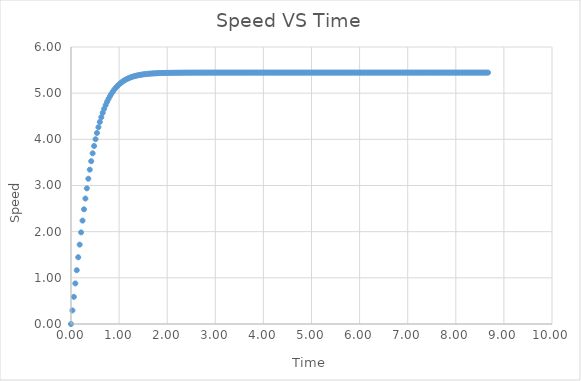
| Category | Series 0 |
|---|---|
| 0.0 | 0 |
| 0.03 | 0.294 |
| 0.06 | 0.588 |
| 0.09 | 0.879 |
| 0.12 | 1.165 |
| 0.15 | 1.446 |
| 0.18 | 1.72 |
| 0.21 | 1.985 |
| 0.24 | 2.24 |
| 0.27 | 2.484 |
| 0.30000000000000004 | 2.717 |
| 0.33000000000000007 | 2.938 |
| 0.3600000000000001 | 3.147 |
| 0.3900000000000001 | 3.343 |
| 0.42000000000000015 | 3.526 |
| 0.4500000000000002 | 3.697 |
| 0.4800000000000002 | 3.856 |
| 0.5100000000000002 | 4.003 |
| 0.5400000000000003 | 4.138 |
| 0.5700000000000003 | 4.262 |
| 0.6000000000000003 | 4.376 |
| 0.6300000000000003 | 4.48 |
| 0.6600000000000004 | 4.575 |
| 0.6900000000000004 | 4.662 |
| 0.7200000000000004 | 4.74 |
| 0.7500000000000004 | 4.812 |
| 0.7800000000000005 | 4.876 |
| 0.8100000000000005 | 4.934 |
| 0.8400000000000005 | 4.987 |
| 0.8700000000000006 | 5.035 |
| 0.9000000000000006 | 5.077 |
| 0.9300000000000006 | 5.116 |
| 0.9600000000000006 | 5.15 |
| 0.9900000000000007 | 5.181 |
| 1.0200000000000007 | 5.209 |
| 1.0500000000000007 | 5.234 |
| 1.0800000000000007 | 5.256 |
| 1.1100000000000008 | 5.276 |
| 1.1400000000000008 | 5.294 |
| 1.1700000000000008 | 5.31 |
| 1.2000000000000008 | 5.325 |
| 1.2300000000000009 | 5.338 |
| 1.260000000000001 | 5.349 |
| 1.290000000000001 | 5.359 |
| 1.320000000000001 | 5.369 |
| 1.350000000000001 | 5.377 |
| 1.380000000000001 | 5.384 |
| 1.410000000000001 | 5.391 |
| 1.440000000000001 | 5.397 |
| 1.470000000000001 | 5.402 |
| 1.500000000000001 | 5.406 |
| 1.5300000000000011 | 5.411 |
| 1.5600000000000012 | 5.414 |
| 1.5900000000000012 | 5.418 |
| 1.6200000000000012 | 5.421 |
| 1.6500000000000012 | 5.423 |
| 1.6800000000000013 | 5.426 |
| 1.7100000000000013 | 5.428 |
| 1.7400000000000013 | 5.43 |
| 1.7700000000000014 | 5.431 |
| 1.8000000000000014 | 5.433 |
| 1.8300000000000014 | 5.434 |
| 1.8600000000000014 | 5.435 |
| 1.8900000000000015 | 5.436 |
| 1.9200000000000015 | 5.437 |
| 1.9500000000000015 | 5.438 |
| 1.9800000000000015 | 5.439 |
| 2.0100000000000016 | 5.44 |
| 2.0400000000000014 | 5.44 |
| 2.070000000000001 | 5.441 |
| 2.100000000000001 | 5.441 |
| 2.130000000000001 | 5.442 |
| 2.1600000000000006 | 5.442 |
| 2.1900000000000004 | 5.442 |
| 2.22 | 5.443 |
| 2.25 | 5.443 |
| 2.28 | 5.443 |
| 2.3099999999999996 | 5.443 |
| 2.3399999999999994 | 5.444 |
| 2.369999999999999 | 5.444 |
| 2.399999999999999 | 5.444 |
| 2.429999999999999 | 5.444 |
| 2.4599999999999986 | 5.444 |
| 2.4899999999999984 | 5.444 |
| 2.5199999999999982 | 5.444 |
| 2.549999999999998 | 5.444 |
| 2.579999999999998 | 5.444 |
| 2.6099999999999977 | 5.445 |
| 2.6399999999999975 | 5.445 |
| 2.6699999999999973 | 5.445 |
| 2.699999999999997 | 5.445 |
| 2.729999999999997 | 5.445 |
| 2.7599999999999967 | 5.445 |
| 2.7899999999999965 | 5.445 |
| 2.8199999999999963 | 5.445 |
| 2.849999999999996 | 5.445 |
| 2.879999999999996 | 5.445 |
| 2.9099999999999957 | 5.445 |
| 2.9399999999999955 | 5.445 |
| 2.9699999999999953 | 5.445 |
| 2.999999999999995 | 5.445 |
| 3.029999999999995 | 5.445 |
| 3.0599999999999947 | 5.445 |
| 3.0899999999999945 | 5.445 |
| 3.1199999999999943 | 5.445 |
| 3.149999999999994 | 5.445 |
| 3.179999999999994 | 5.445 |
| 3.2099999999999937 | 5.445 |
| 3.2399999999999936 | 5.445 |
| 3.2699999999999934 | 5.445 |
| 3.299999999999993 | 5.445 |
| 3.329999999999993 | 5.445 |
| 3.3599999999999928 | 5.445 |
| 3.3899999999999926 | 5.445 |
| 3.4199999999999924 | 5.445 |
| 3.449999999999992 | 5.445 |
| 3.479999999999992 | 5.445 |
| 3.509999999999992 | 5.445 |
| 3.5399999999999916 | 5.445 |
| 3.5699999999999914 | 5.445 |
| 3.599999999999991 | 5.445 |
| 3.629999999999991 | 5.445 |
| 3.659999999999991 | 5.445 |
| 3.6899999999999906 | 5.445 |
| 3.7199999999999904 | 5.445 |
| 3.7499999999999902 | 5.445 |
| 3.77999999999999 | 5.445 |
| 3.80999999999999 | 5.445 |
| 3.8399999999999896 | 5.445 |
| 3.8699999999999894 | 5.445 |
| 3.8999999999999893 | 5.445 |
| 3.929999999999989 | 5.445 |
| 3.959999999999989 | 5.445 |
| 3.9899999999999887 | 5.445 |
| 4.019999999999989 | 5.445 |
| 4.049999999999989 | 5.445 |
| 4.079999999999989 | 5.445 |
| 4.10999999999999 | 5.445 |
| 4.13999999999999 | 5.445 |
| 4.16999999999999 | 5.445 |
| 4.19999999999999 | 5.445 |
| 4.229999999999991 | 5.445 |
| 4.259999999999991 | 5.445 |
| 4.289999999999991 | 5.445 |
| 4.319999999999991 | 5.445 |
| 4.349999999999992 | 5.445 |
| 4.379999999999992 | 5.445 |
| 4.409999999999992 | 5.445 |
| 4.439999999999992 | 5.445 |
| 4.469999999999993 | 5.445 |
| 4.499999999999993 | 5.445 |
| 4.529999999999993 | 5.445 |
| 4.559999999999993 | 5.445 |
| 4.589999999999994 | 5.445 |
| 4.619999999999994 | 5.445 |
| 4.649999999999994 | 5.445 |
| 4.679999999999994 | 5.445 |
| 4.709999999999995 | 5.445 |
| 4.739999999999995 | 5.445 |
| 4.769999999999995 | 5.445 |
| 4.799999999999995 | 5.445 |
| 4.829999999999996 | 5.445 |
| 4.859999999999996 | 5.445 |
| 4.889999999999996 | 5.445 |
| 4.919999999999996 | 5.445 |
| 4.949999999999997 | 5.445 |
| 4.979999999999997 | 5.445 |
| 5.009999999999997 | 5.445 |
| 5.039999999999997 | 5.445 |
| 5.069999999999998 | 5.445 |
| 5.099999999999998 | 5.445 |
| 5.129999999999998 | 5.445 |
| 5.159999999999998 | 5.445 |
| 5.189999999999999 | 5.445 |
| 5.219999999999999 | 5.445 |
| 5.249999999999999 | 5.445 |
| 5.279999999999999 | 5.445 |
| 5.31 | 5.445 |
| 5.34 | 5.445 |
| 5.37 | 5.445 |
| 5.4 | 5.445 |
| 5.430000000000001 | 5.445 |
| 5.460000000000001 | 5.445 |
| 5.490000000000001 | 5.445 |
| 5.520000000000001 | 5.445 |
| 5.550000000000002 | 5.445 |
| 5.580000000000002 | 5.445 |
| 5.610000000000002 | 5.445 |
| 5.640000000000002 | 5.445 |
| 5.670000000000003 | 5.445 |
| 5.700000000000003 | 5.445 |
| 5.730000000000003 | 5.445 |
| 5.760000000000003 | 5.445 |
| 5.790000000000004 | 5.445 |
| 5.820000000000004 | 5.445 |
| 5.850000000000004 | 5.445 |
| 5.880000000000004 | 5.445 |
| 5.910000000000005 | 5.445 |
| 5.940000000000005 | 5.445 |
| 5.970000000000005 | 5.445 |
| 6.000000000000005 | 5.445 |
| 6.030000000000006 | 5.445 |
| 6.060000000000006 | 5.445 |
| 6.090000000000006 | 5.445 |
| 6.120000000000006 | 5.445 |
| 6.150000000000007 | 5.445 |
| 6.180000000000007 | 5.445 |
| 6.210000000000007 | 5.445 |
| 6.240000000000007 | 5.445 |
| 6.270000000000008 | 5.445 |
| 6.300000000000008 | 5.445 |
| 6.330000000000008 | 5.445 |
| 6.360000000000008 | 5.445 |
| 6.390000000000009 | 5.445 |
| 6.420000000000009 | 5.445 |
| 6.450000000000009 | 5.445 |
| 6.480000000000009 | 5.445 |
| 6.51000000000001 | 5.445 |
| 6.54000000000001 | 5.445 |
| 6.57000000000001 | 5.445 |
| 6.60000000000001 | 5.445 |
| 6.6300000000000106 | 5.445 |
| 6.660000000000011 | 5.445 |
| 6.690000000000011 | 5.445 |
| 6.720000000000011 | 5.445 |
| 6.7500000000000115 | 5.445 |
| 6.780000000000012 | 5.445 |
| 6.810000000000012 | 5.445 |
| 6.840000000000012 | 5.445 |
| 6.8700000000000125 | 5.445 |
| 6.900000000000013 | 5.445 |
| 6.930000000000013 | 5.445 |
| 6.960000000000013 | 5.445 |
| 6.9900000000000135 | 5.445 |
| 7.020000000000014 | 5.445 |
| 7.050000000000014 | 5.445 |
| 7.080000000000014 | 5.445 |
| 7.1100000000000145 | 5.445 |
| 7.140000000000015 | 5.445 |
| 7.170000000000015 | 5.445 |
| 7.200000000000015 | 5.445 |
| 7.2300000000000155 | 5.445 |
| 7.260000000000016 | 5.445 |
| 7.290000000000016 | 5.445 |
| 7.320000000000016 | 5.445 |
| 7.3500000000000165 | 5.445 |
| 7.380000000000017 | 5.445 |
| 7.410000000000017 | 5.445 |
| 7.440000000000017 | 5.445 |
| 7.4700000000000175 | 5.445 |
| 7.500000000000018 | 5.445 |
| 7.530000000000018 | 5.445 |
| 7.560000000000018 | 5.445 |
| 7.5900000000000185 | 5.445 |
| 7.620000000000019 | 5.445 |
| 7.650000000000019 | 5.445 |
| 7.680000000000019 | 5.445 |
| 7.7100000000000195 | 5.445 |
| 7.74000000000002 | 5.445 |
| 7.77000000000002 | 5.445 |
| 7.80000000000002 | 5.445 |
| 7.8300000000000205 | 5.445 |
| 7.860000000000021 | 5.445 |
| 7.890000000000021 | 5.445 |
| 7.920000000000021 | 5.445 |
| 7.9500000000000215 | 5.445 |
| 7.980000000000022 | 5.445 |
| 8.010000000000021 | 5.445 |
| 8.04000000000002 | 5.445 |
| 8.07000000000002 | 5.445 |
| 8.10000000000002 | 5.445 |
| 8.130000000000019 | 5.445 |
| 8.160000000000018 | 5.445 |
| 8.190000000000017 | 5.445 |
| 8.220000000000017 | 5.445 |
| 8.250000000000016 | 5.445 |
| 8.280000000000015 | 5.445 |
| 8.310000000000015 | 5.445 |
| 8.340000000000014 | 5.445 |
| 8.370000000000013 | 5.445 |
| 8.400000000000013 | 5.445 |
| 8.430000000000012 | 5.445 |
| 8.460000000000012 | 5.445 |
| 8.49000000000001 | 5.445 |
| 8.52000000000001 | 5.445 |
| 8.55000000000001 | 5.445 |
| 8.580000000000009 | 5.445 |
| 8.610000000000008 | 5.445 |
| 8.640000000000008 | 5.445 |
| 8.670000000000007 | 5.445 |